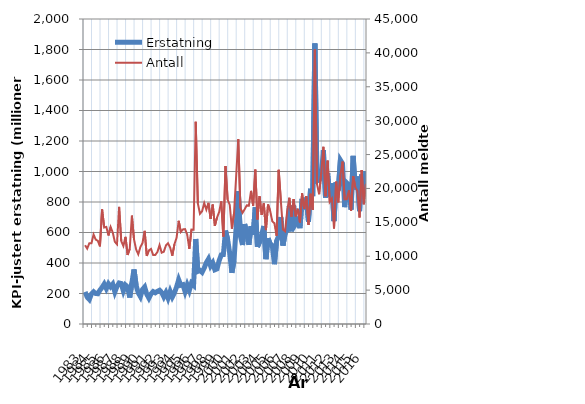
| Category | Erstatning |
|---|---|
| 1983.0 | 210.22 |
| nan | 176.092 |
| nan | 161.035 |
| nan | 197.262 |
| 1984.0 | 211.53 |
| nan | 200.092 |
| nan | 198.387 |
| nan | 221.897 |
| 1985.0 | 239.789 |
| nan | 262.097 |
| nan | 232.248 |
| nan | 263.401 |
| 1986.0 | 244.213 |
| nan | 261.318 |
| nan | 210.326 |
| nan | 246.13 |
| 1987.0 | 268.892 |
| nan | 265.347 |
| nan | 217.144 |
| nan | 255.477 |
| 1988.0 | 243.163 |
| nan | 173.337 |
| nan | 269.977 |
| nan | 357.645 |
| 1989.0 | 252.668 |
| nan | 204.216 |
| nan | 179.693 |
| nan | 226.703 |
| 1990.0 | 242.739 |
| nan | 195.284 |
| nan | 169.363 |
| nan | 197.133 |
| 1991.0 | 212.725 |
| nan | 204.534 |
| nan | 214.059 |
| nan | 221.31 |
| 1992.0 | 206.744 |
| nan | 178.142 |
| nan | 205.839 |
| nan | 169.858 |
| 1993.0 | 213.125 |
| nan | 177.367 |
| nan | 204.917 |
| nan | 242.422 |
| 1994.0 | 290.354 |
| nan | 253.835 |
| nan | 257.894 |
| nan | 212.568 |
| 1995.0 | 256.1 |
| nan | 220.322 |
| nan | 267.715 |
| nan | 254.182 |
| 1996.0 | 557.419 |
| nan | 345.163 |
| nan | 351.33 |
| nan | 338.83 |
| 1997.0 | 366.813 |
| nan | 402.515 |
| nan | 426.268 |
| nan | 380.33 |
| 1998.0 | 401.239 |
| nan | 355.459 |
| nan | 361.267 |
| nan | 415.235 |
| 1999.0 | 452.902 |
| nan | 455.102 |
| nan | 612.398 |
| nan | 554.608 |
| 2000.0 | 462.302 |
| nan | 335.733 |
| nan | 416.214 |
| nan | 634.598 |
| 2001.0 | 870.913 |
| nan | 576.547 |
| nan | 517.816 |
| nan | 655.144 |
| 2002.0 | 596.676 |
| nan | 519.166 |
| nan | 641.6 |
| nan | 584.641 |
| 2003.0 | 764.63 |
| nan | 505.546 |
| nan | 537.836 |
| nan | 585.894 |
| 2004.0 | 642.757 |
| nan | 424.948 |
| nan | 561.798 |
| nan | 525.108 |
| 2005.0 | 513.953 |
| nan | 392.217 |
| nan | 544.503 |
| nan | 577.037 |
| 2006.0 | 701.398 |
| nan | 514.379 |
| nan | 591.856 |
| nan | 617.47 |
| 2007.0 | 772.886 |
| nan | 607.651 |
| nan | 776.377 |
| nan | 656.412 |
| 2008.0 | 678.816 |
| nan | 628.412 |
| nan | 820.743 |
| nan | 788.239 |
| 2009.0 | 827.169 |
| nan | 671.529 |
| nan | 887.072 |
| nan | 838.469 |
| 2010.0 | 1839.261 |
| nan | 938.114 |
| nan | 942.627 |
| nan | 964.348 |
| 2011.0 | 1139.682 |
| nan | 828.751 |
| nan | 988.158 |
| nan | 832.784 |
| 2012.0 | 922.611 |
| nan | 674.513 |
| nan | 929.964 |
| nan | 875.649 |
| 2013.0 | 1075.389 |
| nan | 1053.009 |
| nan | 766.218 |
| nan | 925.502 |
| 2014.0 | 912.794 |
| nan | 749.584 |
| nan | 1102.677 |
| nan | 881.657 |
| 2015.0 | 967.292 |
| nan | 740.776 |
| nan | 980.576 |
| nan | 870.639 |
| 2016.0 | 1000.868 |